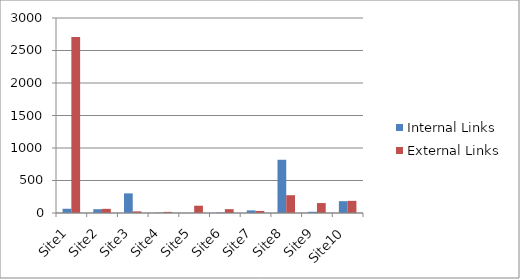
| Category | Internal Links | External Links |
|---|---|---|
| Site1 | 65 | 2708 |
| Site2 | 58 | 64 |
| Site3 | 302 | 25 |
| Site4 | 5 | 17 |
| Site5 | 1 | 112 |
| Site6 | 6 | 59 |
| Site7 | 40 | 32 |
| Site8 | 819 | 274 |
| Site9 | 19 | 153 |
| Site10 | 182 | 187 |